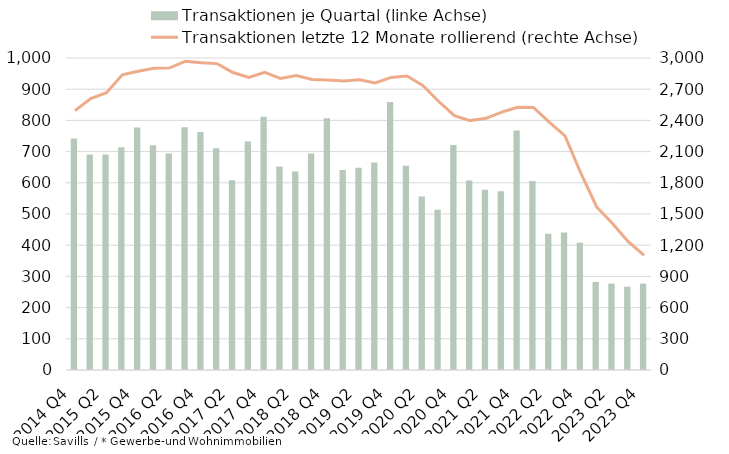
| Category | Transaktionen je Quartal (linke Achse) |
|---|---|
| 2014 Q4 | 742 |
| 2015 Q1 | 691 |
| 2015 Q2 | 691 |
| 2015 Q3 | 714 |
| 2015 Q4 | 777 |
| 2016 Q1 | 720 |
| 2016 Q2 | 694 |
| 2016 Q3 | 778 |
| 2016 Q4 | 763 |
| 2017 Q1 | 711 |
| 2017 Q2 | 608 |
| 2017 Q3 | 732 |
| 2017 Q4 | 812 |
| 2018 Q1 | 652 |
| 2018 Q2 | 636 |
| 2018 Q3 | 694 |
| 2018 Q4 | 807 |
| 2019 Q1 | 641 |
| 2019 Q2 | 648 |
| 2019 Q3 | 665 |
| 2019 Q4 | 859 |
| 2020 Q1 | 655 |
| 2020 Q2 | 556 |
| 2020 Q3 | 514 |
| 2020 Q4 | 721 |
| 2021 Q1 | 607 |
| 2021 Q2 | 578 |
| 2021 Q3 | 573 |
| 2021 Q4 | 768 |
| 2022 Q1 | 606 |
| 2022 Q2 | 437 |
| 2022 Q3 | 441 |
| 2022 Q4 | 408 |
| 2023 Q1 | 282 |
| 2023 Q2 | 277 |
| 2023 Q3 | 267 |
| 2023 Q4 | 277 |